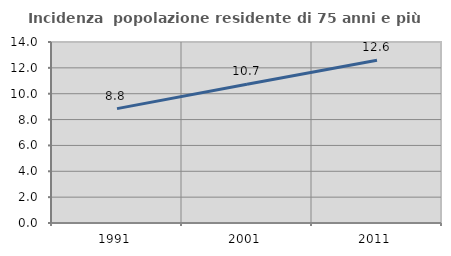
| Category | Incidenza  popolazione residente di 75 anni e più |
|---|---|
| 1991.0 | 8.847 |
| 2001.0 | 10.734 |
| 2011.0 | 12.587 |